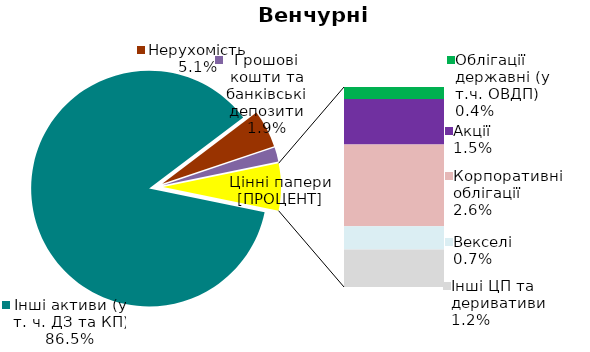
| Category | Series 0 |
|---|---|
| Інші активи (у т. ч. ДЗ та КП) | 0.865 |
| Нерухомість | 0.051 |
| Грошові кошти та банківські депозити | 0.019 |
| Банківські метали | 0 |
| Облігації державні (у т.ч. ОВДП) | 0.004 |
| Облігації місцевих позик | 0 |
| Акції | 0.015 |
| Корпоративні облігації | 0.026 |
| Векселі | 0.007 |
| Інші ЦП та деривативи | 0.012 |